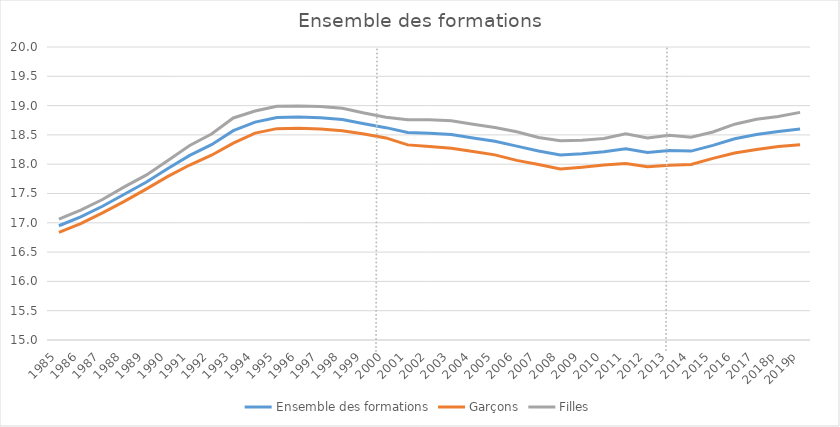
| Category | Ensemble des formations | Garçons | Filles |
|---|---|---|---|
| 1985 | 16.949 | 16.838 | 17.061 |
| 1986 | 17.1 | 16.987 | 17.217 |
| 1987 | 17.282 | 17.17 | 17.397 |
| 1988 | 17.488 | 17.366 | 17.614 |
| 1989 | 17.692 | 17.575 | 17.813 |
| 1990 | 17.927 | 17.793 | 18.065 |
| 1991 | 18.151 | 17.986 | 18.32 |
| 1992 | 18.333 | 18.153 | 18.515 |
| 1993 | 18.572 | 18.359 | 18.789 |
| 1994 | 18.718 | 18.531 | 18.908 |
| 1995 | 18.797 | 18.607 | 18.99 |
| 1996 | 18.805 | 18.615 | 18.992 |
| 1997 | 18.792 | 18.602 | 18.985 |
| 1998 | 18.764 | 18.571 | 18.955 |
| 1999 | 18.692 | 18.514 | 18.873 |
| 2000 | 18.624 | 18.448 | 18.803 |
| 2001 | 18.543 | 18.33 | 18.759 |
| 2002 | 18.528 | 18.301 | 18.758 |
| 2003 | 18.505 | 18.272 | 18.741 |
| 2004 | 18.448 | 18.216 | 18.682 |
| 2005 | 18.39 | 18.159 | 18.625 |
| 2006 | 18.308 | 18.065 | 18.555 |
| 2007 | 18.224 | 17.994 | 18.456 |
| 2008 | 18.157 | 17.918 | 18.401 |
| 2009 | 18.177 | 17.949 | 18.41 |
| 2010 | 18.213 | 17.986 | 18.438 |
| 2011 | 18.264 | 18.011 | 18.521 |
| 2012 | 18.2 | 17.958 | 18.449 |
| 2013 | 18.236 | 17.983 | 18.495 |
| 2014 | 18.224 | 17.994 | 18.46 |
| 2015 | 18.321 | 18.099 | 18.549 |
| 2016 | 18.433 | 18.191 | 18.683 |
| 2017 | 18.505 | 18.251 | 18.767 |
| 2018p | 18.556 | 18.303 | 18.813 |
| 2019p | 18.602 | 18.331 | 18.885 |